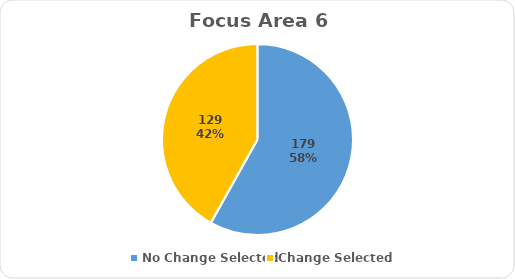
| Category | Series 0 |
|---|---|
| No Change Selected | 179 |
| Change Selected | 129 |